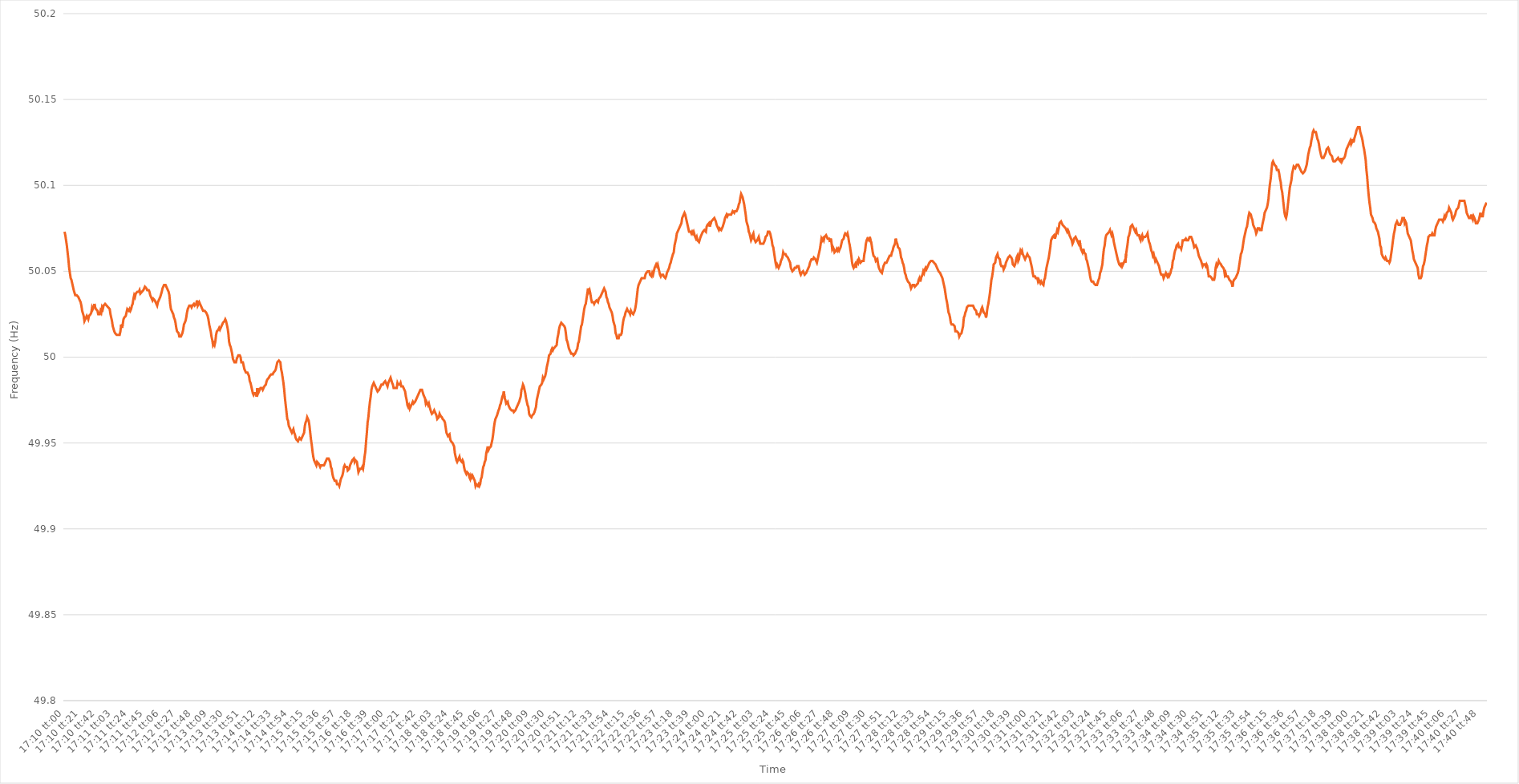
| Category | Series 0 |
|---|---|
| 0.7152777777777778 | 50.073 |
| 0.7152893518518518 | 50.071 |
| 0.7153009259259259 | 50.068 |
| 0.7153125 | 50.065 |
| 0.7153240740740742 | 50.061 |
| 0.7153356481481481 | 50.057 |
| 0.7153472222222222 | 50.052 |
| 0.7153587962962963 | 50.049 |
| 0.7153703703703704 | 50.046 |
| 0.7153819444444444 | 50.045 |
| 0.7153935185185185 | 50.043 |
| 0.7154050925925927 | 50.041 |
| 0.7154166666666667 | 50.039 |
| 0.7154282407407407 | 50.039 |
| 0.7154398148148148 | 50.036 |
| 0.7154513888888889 | 50.036 |
| 0.7154629629629629 | 50.036 |
| 0.715474537037037 | 50.036 |
| 0.7154861111111112 | 50.035 |
| 0.7154976851851852 | 50.034 |
| 0.7155092592592592 | 50.033 |
| 0.7155208333333333 | 50.032 |
| 0.7155324074074074 | 50.03 |
| 0.7155439814814816 | 50.027 |
| 0.7155555555555555 | 50.027 |
| 0.7155671296296297 | 50.024 |
| 0.7155787037037037 | 50.021 |
| 0.7155902777777778 | 50.022 |
| 0.7156018518518518 | 50.022 |
| 0.7156134259259259 | 50.024 |
| 0.7156250000000001 | 50.023 |
| 0.7156365740740741 | 50.022 |
| 0.7156481481481481 | 50.024 |
| 0.7156597222222222 | 50.024 |
| 0.7156712962962963 | 50.025 |
| 0.7156828703703703 | 50.026 |
| 0.7156944444444444 | 50.029 |
| 0.7157060185185186 | 50.028 |
| 0.7157175925925926 | 50.029 |
| 0.7157291666666666 | 50.031 |
| 0.7157407407407407 | 50.029 |
| 0.7157523148148148 | 50.028 |
| 0.715763888888889 | 50.028 |
| 0.7157754629629629 | 50.027 |
| 0.715787037037037 | 50.025 |
| 0.7157986111111111 | 50.025 |
| 0.7158101851851852 | 50.025 |
| 0.7158217592592592 | 50.027 |
| 0.7158333333333333 | 50.026 |
| 0.7158449074074075 | 50.029 |
| 0.7158564814814815 | 50.028 |
| 0.7158680555555555 | 50.03 |
| 0.7158796296296296 | 50.03 |
| 0.7158912037037037 | 50.031 |
| 0.7159027777777779 | 50.031 |
| 0.7159143518518518 | 50.03 |
| 0.715925925925926 | 50.03 |
| 0.7159375 | 50.029 |
| 0.715949074074074 | 50.029 |
| 0.7159606481481481 | 50.028 |
| 0.7159722222222222 | 50.025 |
| 0.7159837962962964 | 50.023 |
| 0.7159953703703703 | 50.021 |
| 0.7160069444444445 | 50.018 |
| 0.7160185185185185 | 50.018 |
| 0.7160300925925926 | 50.015 |
| 0.7160416666666666 | 50.014 |
| 0.7160532407407407 | 50.014 |
| 0.7160648148148149 | 50.013 |
| 0.7160763888888889 | 50.013 |
| 0.716087962962963 | 50.013 |
| 0.716099537037037 | 50.013 |
| 0.7161111111111111 | 50.013 |
| 0.7161226851851853 | 50.015 |
| 0.7161342592592592 | 50.019 |
| 0.7161458333333334 | 50.017 |
| 0.7161574074074074 | 50.019 |
| 0.7161689814814814 | 50.022 |
| 0.7161805555555555 | 50.023 |
| 0.7161921296296296 | 50.023 |
| 0.7162037037037038 | 50.024 |
| 0.7162152777777777 | 50.026 |
| 0.7162268518518519 | 50.028 |
| 0.7162384259259259 | 50.028 |
| 0.71625 | 50.027 |
| 0.716261574074074 | 50.028 |
| 0.7162731481481481 | 50.027 |
| 0.7162847222222223 | 50.028 |
| 0.7162962962962963 | 50.03 |
| 0.7163078703703704 | 50.031 |
| 0.7163194444444444 | 50.034 |
| 0.7163310185185185 | 50.036 |
| 0.7163425925925927 | 50.035 |
| 0.7163541666666666 | 50.037 |
| 0.7163657407407408 | 50.037 |
| 0.7163773148148148 | 50.038 |
| 0.7163888888888889 | 50.038 |
| 0.7164004629629629 | 50.038 |
| 0.716412037037037 | 50.039 |
| 0.7164236111111112 | 50.037 |
| 0.7164351851851851 | 50.037 |
| 0.7164467592592593 | 50.038 |
| 0.7164583333333333 | 50.038 |
| 0.7164699074074075 | 50.039 |
| 0.7164814814814814 | 50.039 |
| 0.7164930555555555 | 50.041 |
| 0.7165046296296297 | 50.041 |
| 0.7165162037037037 | 50.04 |
| 0.7165277777777778 | 50.039 |
| 0.7165393518518518 | 50.039 |
| 0.716550925925926 | 50.039 |
| 0.7165625000000001 | 50.038 |
| 0.716574074074074 | 50.036 |
| 0.7165856481481482 | 50.036 |
| 0.7165972222222222 | 50.034 |
| 0.7166087962962964 | 50.033 |
| 0.7166203703703703 | 50.034 |
| 0.7166319444444444 | 50.034 |
| 0.7166435185185186 | 50.033 |
| 0.7166550925925925 | 50.032 |
| 0.7166666666666667 | 50.031 |
| 0.7166782407407407 | 50.03 |
| 0.7166898148148149 | 50.032 |
| 0.7167013888888888 | 50.033 |
| 0.7167129629629629 | 50.033 |
| 0.7167245370370371 | 50.035 |
| 0.7167361111111111 | 50.035 |
| 0.7167476851851852 | 50.038 |
| 0.7167592592592592 | 50.04 |
| 0.7167708333333334 | 50.041 |
| 0.7167824074074075 | 50.042 |
| 0.7167939814814814 | 50.042 |
| 0.7168055555555556 | 50.042 |
| 0.7168171296296296 | 50.041 |
| 0.7168287037037038 | 50.04 |
| 0.7168402777777777 | 50.04 |
| 0.7168518518518519 | 50.038 |
| 0.716863425925926 | 50.036 |
| 0.7168749999999999 | 50.031 |
| 0.7168865740740741 | 50.028 |
| 0.7168981481481481 | 50.027 |
| 0.7169097222222223 | 50.027 |
| 0.7169212962962962 | 50.025 |
| 0.7169328703703703 | 50.023 |
| 0.7169444444444445 | 50.022 |
| 0.7169560185185185 | 50.02 |
| 0.7169675925925926 | 50.017 |
| 0.7169791666666666 | 50.015 |
| 0.7169907407407408 | 50.015 |
| 0.7170023148148149 | 50.014 |
| 0.7170138888888888 | 50.012 |
| 0.717025462962963 | 50.012 |
| 0.717037037037037 | 50.012 |
| 0.7170486111111112 | 50.012 |
| 0.7170601851851851 | 50.014 |
| 0.7170717592592593 | 50.016 |
| 0.7170833333333334 | 50.019 |
| 0.7170949074074073 | 50.02 |
| 0.7171064814814815 | 50.021 |
| 0.7171180555555555 | 50.023 |
| 0.7171296296296297 | 50.026 |
| 0.7171412037037036 | 50.028 |
| 0.7171527777777778 | 50.028 |
| 0.7171643518518519 | 50.03 |
| 0.7171759259259259 | 50.03 |
| 0.7171875 | 50.03 |
| 0.717199074074074 | 50.029 |
| 0.7172106481481482 | 50.03 |
| 0.7172222222222223 | 50.03 |
| 0.7172337962962962 | 50.031 |
| 0.7172453703703704 | 50.03 |
| 0.7172569444444444 | 50.03 |
| 0.7172685185185186 | 50.031 |
| 0.7172800925925925 | 50.033 |
| 0.7172916666666667 | 50.03 |
| 0.7173032407407408 | 50.031 |
| 0.7173148148148148 | 50.032 |
| 0.7173263888888889 | 50.031 |
| 0.7173379629629629 | 50.03 |
| 0.7173495370370371 | 50.029 |
| 0.717361111111111 | 50.028 |
| 0.7173726851851852 | 50.027 |
| 0.7173842592592593 | 50.027 |
| 0.7173958333333333 | 50.027 |
| 0.7174074074074074 | 50.027 |
| 0.7174189814814814 | 50.026 |
| 0.7174305555555556 | 50.026 |
| 0.7174421296296297 | 50.024 |
| 0.7174537037037036 | 50.022 |
| 0.7174652777777778 | 50.019 |
| 0.7174768518518518 | 50.017 |
| 0.717488425925926 | 50.015 |
| 0.7174999999999999 | 50.012 |
| 0.7175115740740741 | 50.01 |
| 0.7175231481481482 | 50.007 |
| 0.7175347222222223 | 50.008 |
| 0.7175462962962963 | 50.007 |
| 0.7175578703703703 | 50.009 |
| 0.7175694444444445 | 50.013 |
| 0.7175810185185184 | 50.015 |
| 0.7175925925925926 | 50.015 |
| 0.7176041666666667 | 50.016 |
| 0.7176157407407407 | 50.017 |
| 0.7176273148148148 | 50.016 |
| 0.7176388888888888 | 50.017 |
| 0.717650462962963 | 50.018 |
| 0.7176620370370371 | 50.018 |
| 0.717673611111111 | 50.02 |
| 0.7176851851851852 | 50.02 |
| 0.7176967592592592 | 50.021 |
| 0.7177083333333334 | 50.022 |
| 0.7177199074074073 | 50.021 |
| 0.7177314814814815 | 50.019 |
| 0.7177430555555556 | 50.017 |
| 0.7177546296296297 | 50.014 |
| 0.7177662037037037 | 50.009 |
| 0.7177777777777777 | 50.007 |
| 0.7177893518518519 | 50.006 |
| 0.717800925925926 | 50.004 |
| 0.7178125 | 50.002 |
| 0.7178240740740741 | 49.999 |
| 0.7178356481481482 | 49.998 |
| 0.7178472222222222 | 49.997 |
| 0.7178587962962962 | 49.997 |
| 0.7178703703703704 | 49.997 |
| 0.7178819444444445 | 49.999 |
| 0.7178935185185185 | 50 |
| 0.7179050925925926 | 50.001 |
| 0.7179166666666666 | 50.001 |
| 0.7179282407407408 | 50.001 |
| 0.7179398148148147 | 50 |
| 0.7179513888888889 | 49.997 |
| 0.717962962962963 | 49.997 |
| 0.7179745370370371 | 49.997 |
| 0.7179861111111111 | 49.995 |
| 0.7179976851851851 | 49.993 |
| 0.7180092592592593 | 49.992 |
| 0.7180208333333334 | 49.991 |
| 0.7180324074074074 | 49.991 |
| 0.7180439814814815 | 49.991 |
| 0.7180555555555556 | 49.99 |
| 0.7180671296296296 | 49.989 |
| 0.7180787037037036 | 49.986 |
| 0.7180902777777778 | 49.985 |
| 0.7181018518518519 | 49.983 |
| 0.7181134259259259 | 49.981 |
| 0.718125 | 49.979 |
| 0.718136574074074 | 49.978 |
| 0.7181481481481482 | 49.979 |
| 0.7181597222222221 | 49.979 |
| 0.7181712962962963 | 49.979 |
| 0.7181828703703704 | 49.977 |
| 0.7181944444444445 | 49.982 |
| 0.7182060185185185 | 49.979 |
| 0.7182175925925925 | 49.979 |
| 0.7182291666666667 | 49.981 |
| 0.7182407407407408 | 49.982 |
| 0.7182523148148148 | 49.982 |
| 0.7182638888888889 | 49.982 |
| 0.718275462962963 | 49.981 |
| 0.718287037037037 | 49.982 |
| 0.718298611111111 | 49.983 |
| 0.7183101851851852 | 49.983 |
| 0.7183217592592593 | 49.984 |
| 0.7183333333333333 | 49.986 |
| 0.7183449074074074 | 49.987 |
| 0.7183564814814815 | 49.987 |
| 0.7183680555555556 | 49.988 |
| 0.7183796296296295 | 49.989 |
| 0.7183912037037037 | 49.989 |
| 0.7184027777777778 | 49.99 |
| 0.7184143518518519 | 49.99 |
| 0.7184259259259259 | 49.99 |
| 0.7184375 | 49.991 |
| 0.7184490740740741 | 49.991 |
| 0.7184606481481483 | 49.992 |
| 0.7184722222222222 | 49.993 |
| 0.7184837962962963 | 49.995 |
| 0.7184953703703704 | 49.997 |
| 0.7185069444444445 | 49.997 |
| 0.7185185185185184 | 49.998 |
| 0.7185300925925926 | 49.998 |
| 0.7185416666666667 | 49.997 |
| 0.7185532407407407 | 49.993 |
| 0.7185648148148148 | 49.991 |
| 0.7185763888888889 | 49.988 |
| 0.718587962962963 | 49.985 |
| 0.7185995370370369 | 49.981 |
| 0.7186111111111111 | 49.976 |
| 0.7186226851851852 | 49.972 |
| 0.7186342592592593 | 49.968 |
| 0.7186458333333333 | 49.964 |
| 0.7186574074074074 | 49.963 |
| 0.7186689814814815 | 49.96 |
| 0.7186805555555557 | 49.959 |
| 0.7186921296296296 | 49.958 |
| 0.7187037037037037 | 49.958 |
| 0.7187152777777778 | 49.956 |
| 0.7187268518518519 | 49.956 |
| 0.7187384259259259 | 49.958 |
| 0.71875 | 49.956 |
| 0.7187615740740741 | 49.955 |
| 0.7187731481481481 | 49.953 |
| 0.7187847222222222 | 49.952 |
| 0.7187962962962963 | 49.952 |
| 0.7188078703703704 | 49.951 |
| 0.7188194444444443 | 49.952 |
| 0.7188310185185185 | 49.953 |
| 0.7188425925925926 | 49.953 |
| 0.7188541666666667 | 49.952 |
| 0.7188657407407407 | 49.953 |
| 0.7188773148148148 | 49.954 |
| 0.7188888888888889 | 49.955 |
| 0.7189004629629631 | 49.956 |
| 0.718912037037037 | 49.96 |
| 0.7189236111111111 | 49.962 |
| 0.7189351851851852 | 49.963 |
| 0.7189467592592593 | 49.965 |
| 0.7189583333333333 | 49.965 |
| 0.7189699074074074 | 49.963 |
| 0.7189814814814816 | 49.96 |
| 0.7189930555555555 | 49.956 |
| 0.7190046296296296 | 49.952 |
| 0.7190162037037037 | 49.949 |
| 0.7190277777777778 | 49.945 |
| 0.7190393518518517 | 49.942 |
| 0.7190509259259259 | 49.94 |
| 0.7190625 | 49.939 |
| 0.7190740740740741 | 49.938 |
| 0.7190856481481481 | 49.937 |
| 0.7190972222222222 | 49.939 |
| 0.7191087962962963 | 49.939 |
| 0.7191203703703705 | 49.938 |
| 0.7191319444444444 | 49.937 |
| 0.7191435185185185 | 49.936 |
| 0.7191550925925926 | 49.937 |
| 0.7191666666666667 | 49.937 |
| 0.7191782407407407 | 49.937 |
| 0.7191898148148148 | 49.937 |
| 0.719201388888889 | 49.937 |
| 0.719212962962963 | 49.937 |
| 0.719224537037037 | 49.939 |
| 0.7192361111111111 | 49.94 |
| 0.7192476851851852 | 49.941 |
| 0.7192592592592592 | 49.941 |
| 0.7192708333333333 | 49.941 |
| 0.7192824074074075 | 49.94 |
| 0.7192939814814815 | 49.939 |
| 0.7193055555555555 | 49.936 |
| 0.7193171296296296 | 49.935 |
| 0.7193287037037037 | 49.932 |
| 0.7193402777777779 | 49.93 |
| 0.7193518518518518 | 49.929 |
| 0.719363425925926 | 49.928 |
| 0.719375 | 49.928 |
| 0.7193865740740741 | 49.928 |
| 0.7193981481481481 | 49.926 |
| 0.7194097222222222 | 49.926 |
| 0.7194212962962964 | 49.926 |
| 0.7194328703703704 | 49.925 |
| 0.7194444444444444 | 49.927 |
| 0.7194560185185185 | 49.929 |
| 0.7194675925925926 | 49.93 |
| 0.7194791666666666 | 49.931 |
| 0.7194907407407407 | 49.933 |
| 0.7195023148148149 | 49.936 |
| 0.7195138888888889 | 49.937 |
| 0.7195254629629629 | 49.936 |
| 0.719537037037037 | 49.936 |
| 0.7195486111111111 | 49.936 |
| 0.7195601851851853 | 49.934 |
| 0.7195717592592592 | 49.934 |
| 0.7195833333333334 | 49.935 |
| 0.7195949074074074 | 49.937 |
| 0.7196064814814815 | 49.937 |
| 0.7196180555555555 | 49.939 |
| 0.7196296296296296 | 49.94 |
| 0.7196412037037038 | 49.94 |
| 0.7196527777777778 | 49.941 |
| 0.7196643518518518 | 49.939 |
| 0.7196759259259259 | 49.94 |
| 0.7196875 | 49.94 |
| 0.719699074074074 | 49.939 |
| 0.7197106481481481 | 49.936 |
| 0.7197222222222223 | 49.933 |
| 0.7197337962962963 | 49.934 |
| 0.7197453703703703 | 49.935 |
| 0.7197569444444444 | 49.935 |
| 0.7197685185185185 | 49.935 |
| 0.7197800925925927 | 49.936 |
| 0.7197916666666666 | 49.935 |
| 0.7198032407407408 | 49.938 |
| 0.7198148148148148 | 49.942 |
| 0.719826388888889 | 49.945 |
| 0.7198379629629629 | 49.951 |
| 0.719849537037037 | 49.956 |
| 0.7198611111111112 | 49.962 |
| 0.7198726851851852 | 49.965 |
| 0.7198842592592593 | 49.97 |
| 0.7198958333333333 | 49.974 |
| 0.7199074074074074 | 49.977 |
| 0.7199189814814816 | 49.981 |
| 0.7199305555555555 | 49.983 |
| 0.7199421296296297 | 49.984 |
| 0.7199537037037037 | 49.985 |
| 0.7199652777777777 | 49.985 |
| 0.7199768518518518 | 49.983 |
| 0.7199884259259259 | 49.982 |
| 0.7200000000000001 | 49.981 |
| 0.720011574074074 | 49.98 |
| 0.7200231481481482 | 49.98 |
| 0.7200347222222222 | 49.981 |
| 0.7200462962962964 | 49.982 |
| 0.7200578703703703 | 49.983 |
| 0.7200694444444444 | 49.984 |
| 0.7200810185185186 | 49.984 |
| 0.7200925925925926 | 49.984 |
| 0.7201041666666667 | 49.985 |
| 0.7201157407407407 | 49.985 |
| 0.7201273148148148 | 49.986 |
| 0.720138888888889 | 49.986 |
| 0.7201504629629629 | 49.984 |
| 0.7201620370370371 | 49.983 |
| 0.7201736111111111 | 49.985 |
| 0.7201851851851852 | 49.986 |
| 0.7201967592592592 | 49.987 |
| 0.7202083333333333 | 49.988 |
| 0.7202199074074075 | 49.988 |
| 0.7202314814814814 | 49.985 |
| 0.7202430555555556 | 49.984 |
| 0.7202546296296296 | 49.982 |
| 0.7202662037037038 | 49.982 |
| 0.7202777777777777 | 49.982 |
| 0.7202893518518518 | 49.982 |
| 0.720300925925926 | 49.982 |
| 0.7203125 | 49.985 |
| 0.7203240740740741 | 49.984 |
| 0.7203356481481481 | 49.984 |
| 0.7203472222222222 | 49.984 |
| 0.7203587962962964 | 49.985 |
| 0.7203703703703703 | 49.983 |
| 0.7203819444444445 | 49.983 |
| 0.7203935185185185 | 49.983 |
| 0.7204050925925927 | 49.982 |
| 0.7204166666666666 | 49.981 |
| 0.7204282407407407 | 49.98 |
| 0.7204398148148149 | 49.977 |
| 0.7204513888888888 | 49.975 |
| 0.720462962962963 | 49.972 |
| 0.720474537037037 | 49.971 |
| 0.7204861111111112 | 49.972 |
| 0.7204976851851851 | 49.97 |
| 0.7205092592592592 | 49.971 |
| 0.7205208333333334 | 49.972 |
| 0.7205324074074074 | 49.973 |
| 0.7205439814814815 | 49.974 |
| 0.7205555555555555 | 49.973 |
| 0.7205671296296297 | 49.973 |
| 0.7205787037037038 | 49.974 |
| 0.7205902777777777 | 49.975 |
| 0.7206018518518519 | 49.976 |
| 0.7206134259259259 | 49.977 |
| 0.7206250000000001 | 49.978 |
| 0.720636574074074 | 49.979 |
| 0.7206481481481481 | 49.979 |
| 0.7206597222222223 | 49.981 |
| 0.7206712962962962 | 49.981 |
| 0.7206828703703704 | 49.981 |
| 0.7206944444444444 | 49.981 |
| 0.7207060185185186 | 49.978 |
| 0.7207175925925925 | 49.977 |
| 0.7207291666666666 | 49.976 |
| 0.7207407407407408 | 49.973 |
| 0.7207523148148148 | 49.974 |
| 0.7207638888888889 | 49.973 |
| 0.7207754629629629 | 49.972 |
| 0.7207870370370371 | 49.973 |
| 0.7207986111111112 | 49.971 |
| 0.7208101851851851 | 49.971 |
| 0.7208217592592593 | 49.968 |
| 0.7208333333333333 | 49.967 |
| 0.7208449074074075 | 49.967 |
| 0.7208564814814814 | 49.968 |
| 0.7208680555555556 | 49.969 |
| 0.7208796296296297 | 49.968 |
| 0.7208912037037036 | 49.967 |
| 0.7209027777777778 | 49.966 |
| 0.7209143518518518 | 49.964 |
| 0.720925925925926 | 49.964 |
| 0.7209374999999999 | 49.965 |
| 0.720949074074074 | 49.967 |
| 0.7209606481481482 | 49.966 |
| 0.7209722222222222 | 49.966 |
| 0.7209837962962963 | 49.965 |
| 0.7209953703703703 | 49.964 |
| 0.7210069444444445 | 49.964 |
| 0.7210185185185186 | 49.963 |
| 0.7210300925925925 | 49.962 |
| 0.7210416666666667 | 49.959 |
| 0.7210532407407407 | 49.956 |
| 0.7210648148148149 | 49.956 |
| 0.7210763888888888 | 49.954 |
| 0.721087962962963 | 49.954 |
| 0.7210995370370371 | 49.955 |
| 0.721111111111111 | 49.952 |
| 0.7211226851851852 | 49.951 |
| 0.7211342592592592 | 49.951 |
| 0.7211458333333334 | 49.95 |
| 0.7211574074074073 | 49.95 |
| 0.7211689814814815 | 49.948 |
| 0.7211805555555556 | 49.944 |
| 0.7211921296296296 | 49.942 |
| 0.7212037037037037 | 49.94 |
| 0.7212152777777777 | 49.939 |
| 0.7212268518518519 | 49.94 |
| 0.721238425925926 | 49.94 |
| 0.72125 | 49.942 |
| 0.7212615740740741 | 49.94 |
| 0.7212731481481481 | 49.94 |
| 0.7212847222222223 | 49.939 |
| 0.7212962962962962 | 49.94 |
| 0.7213078703703704 | 49.939 |
| 0.7213194444444445 | 49.936 |
| 0.7213310185185186 | 49.934 |
| 0.7213425925925926 | 49.934 |
| 0.7213541666666666 | 49.932 |
| 0.7213657407407408 | 49.933 |
| 0.7213773148148147 | 49.933 |
| 0.7213888888888889 | 49.932 |
| 0.721400462962963 | 49.93 |
| 0.721412037037037 | 49.929 |
| 0.7214236111111111 | 49.931 |
| 0.7214351851851851 | 49.93 |
| 0.7214467592592593 | 49.931 |
| 0.7214583333333334 | 49.93 |
| 0.7214699074074074 | 49.929 |
| 0.7214814814814815 | 49.928 |
| 0.7214930555555555 | 49.925 |
| 0.7215046296296297 | 49.926 |
| 0.7215162037037036 | 49.926 |
| 0.7215277777777778 | 49.925 |
| 0.7215393518518519 | 49.926 |
| 0.721550925925926 | 49.925 |
| 0.7215625 | 49.926 |
| 0.721574074074074 | 49.929 |
| 0.7215856481481482 | 49.93 |
| 0.7215972222222223 | 49.933 |
| 0.7216087962962963 | 49.936 |
| 0.7216203703703704 | 49.937 |
| 0.7216319444444445 | 49.939 |
| 0.7216435185185185 | 49.94 |
| 0.7216550925925925 | 49.944 |
| 0.7216666666666667 | 49.946 |
| 0.7216782407407408 | 49.948 |
| 0.7216898148148148 | 49.946 |
| 0.7217013888888889 | 49.947 |
| 0.721712962962963 | 49.947 |
| 0.7217245370370371 | 49.948 |
| 0.721736111111111 | 49.95 |
| 0.7217476851851852 | 49.952 |
| 0.7217592592592593 | 49.955 |
| 0.7217708333333334 | 49.959 |
| 0.7217824074074074 | 49.962 |
| 0.7217939814814814 | 49.964 |
| 0.7218055555555556 | 49.965 |
| 0.7218171296296297 | 49.966 |
| 0.7218287037037037 | 49.966 |
| 0.7218402777777778 | 49.969 |
| 0.7218518518518519 | 49.97 |
| 0.7218634259259259 | 49.972 |
| 0.7218749999999999 | 49.973 |
| 0.7218865740740741 | 49.975 |
| 0.7218981481481482 | 49.977 |
| 0.7219097222222222 | 49.978 |
| 0.7219212962962963 | 49.98 |
| 0.7219328703703703 | 49.976 |
| 0.7219444444444445 | 49.975 |
| 0.7219560185185184 | 49.973 |
| 0.7219675925925926 | 49.973 |
| 0.7219791666666667 | 49.974 |
| 0.7219907407407408 | 49.972 |
| 0.7220023148148148 | 49.971 |
| 0.7220138888888888 | 49.97 |
| 0.722025462962963 | 49.97 |
| 0.7220370370370371 | 49.969 |
| 0.7220486111111111 | 49.969 |
| 0.7220601851851852 | 49.969 |
| 0.7220717592592593 | 49.968 |
| 0.7220833333333333 | 49.968 |
| 0.7220949074074073 | 49.969 |
| 0.7221064814814815 | 49.97 |
| 0.7221180555555556 | 49.971 |
| 0.7221296296296296 | 49.972 |
| 0.7221412037037037 | 49.973 |
| 0.7221527777777778 | 49.974 |
| 0.7221643518518519 | 49.974 |
| 0.7221759259259258 | 49.977 |
| 0.7221875 | 49.981 |
| 0.7221990740740741 | 49.982 |
| 0.7222106481481482 | 49.984 |
| 0.7222222222222222 | 49.983 |
| 0.7222337962962962 | 49.981 |
| 0.7222453703703704 | 49.979 |
| 0.7222569444444445 | 49.976 |
| 0.7222685185185185 | 49.974 |
| 0.7222800925925926 | 49.972 |
| 0.7222916666666667 | 49.971 |
| 0.7223032407407407 | 49.967 |
| 0.7223148148148147 | 49.966 |
| 0.7223263888888889 | 49.966 |
| 0.722337962962963 | 49.965 |
| 0.722349537037037 | 49.966 |
| 0.7223611111111111 | 49.966 |
| 0.7223726851851852 | 49.967 |
| 0.7223842592592593 | 49.968 |
| 0.7223958333333332 | 49.968 |
| 0.7224074074074074 | 49.971 |
| 0.7224189814814815 | 49.975 |
| 0.7224305555555556 | 49.977 |
| 0.7224421296296296 | 49.979 |
| 0.7224537037037037 | 49.981 |
| 0.7224652777777778 | 49.983 |
| 0.722476851851852 | 49.983 |
| 0.7224884259259259 | 49.984 |
| 0.7225 | 49.985 |
| 0.7225115740740741 | 49.988 |
| 0.7225231481481482 | 49.987 |
| 0.7225347222222221 | 49.988 |
| 0.7225462962962963 | 49.989 |
| 0.7225578703703704 | 49.991 |
| 0.7225694444444444 | 49.994 |
| 0.7225810185185185 | 49.996 |
| 0.7225925925925926 | 49.998 |
| 0.7226041666666667 | 50.001 |
| 0.7226157407407406 | 50.001 |
| 0.7226273148148148 | 50.002 |
| 0.7226388888888889 | 50.004 |
| 0.722650462962963 | 50.005 |
| 0.722662037037037 | 50.004 |
| 0.7226736111111111 | 50.005 |
| 0.7226851851851852 | 50.005 |
| 0.7226967592592594 | 50.006 |
| 0.7227083333333333 | 50.006 |
| 0.7227199074074074 | 50.007 |
| 0.7227314814814815 | 50.011 |
| 0.7227430555555556 | 50.013 |
| 0.7227546296296296 | 50.016 |
| 0.7227662037037037 | 50.018 |
| 0.7227777777777779 | 50.019 |
| 0.7227893518518518 | 50.02 |
| 0.7228009259259259 | 50.02 |
| 0.7228125 | 50.019 |
| 0.7228240740740741 | 50.019 |
| 0.722835648148148 | 50.018 |
| 0.7228472222222222 | 50.017 |
| 0.7228587962962963 | 50.014 |
| 0.7228703703703704 | 50.01 |
| 0.7228819444444444 | 50.009 |
| 0.7228935185185185 | 50.007 |
| 0.7229050925925926 | 50.005 |
| 0.7229166666666668 | 50.004 |
| 0.7229282407407407 | 50.003 |
| 0.7229398148148148 | 50.002 |
| 0.7229513888888889 | 50.002 |
| 0.722962962962963 | 50.002 |
| 0.722974537037037 | 50.001 |
| 0.7229861111111111 | 50.001 |
| 0.7229976851851853 | 50.002 |
| 0.7230092592592593 | 50.003 |
| 0.7230208333333333 | 50.004 |
| 0.7230324074074074 | 50.005 |
| 0.7230439814814815 | 50.008 |
| 0.7230555555555555 | 50.009 |
| 0.7230671296296296 | 50.012 |
| 0.7230787037037038 | 50.015 |
| 0.7230902777777778 | 50.018 |
| 0.7231018518518518 | 50.019 |
| 0.7231134259259259 | 50.022 |
| 0.723125 | 50.025 |
| 0.7231365740740742 | 50.028 |
| 0.7231481481481481 | 50.03 |
| 0.7231597222222222 | 50.031 |
| 0.7231712962962963 | 50.034 |
| 0.7231828703703704 | 50.037 |
| 0.7231944444444444 | 50.04 |
| 0.7232060185185185 | 50.038 |
| 0.7232175925925927 | 50.039 |
| 0.7232291666666667 | 50.037 |
| 0.7232407407407407 | 50.034 |
| 0.7232523148148148 | 50.032 |
| 0.7232638888888889 | 50.032 |
| 0.7232754629629629 | 50.032 |
| 0.723287037037037 | 50.031 |
| 0.7232986111111112 | 50.032 |
| 0.7233101851851852 | 50.032 |
| 0.7233217592592592 | 50.033 |
| 0.7233333333333333 | 50.033 |
| 0.7233449074074074 | 50.032 |
| 0.7233564814814816 | 50.034 |
| 0.7233680555555555 | 50.034 |
| 0.7233796296296297 | 50.035 |
| 0.7233912037037037 | 50.035 |
| 0.7234027777777778 | 50.037 |
| 0.7234143518518518 | 50.037 |
| 0.7234259259259259 | 50.039 |
| 0.7234375000000001 | 50.04 |
| 0.7234490740740741 | 50.039 |
| 0.7234606481481481 | 50.038 |
| 0.7234722222222222 | 50.035 |
| 0.7234837962962963 | 50.034 |
| 0.7234953703703703 | 50.032 |
| 0.7235069444444444 | 50.031 |
| 0.7235185185185186 | 50.029 |
| 0.7235300925925926 | 50.028 |
| 0.7235416666666666 | 50.027 |
| 0.7235532407407407 | 50.026 |
| 0.7235648148148148 | 50.024 |
| 0.723576388888889 | 50.021 |
| 0.7235879629629629 | 50.021 |
| 0.723599537037037 | 50.018 |
| 0.7236111111111111 | 50.014 |
| 0.7236226851851852 | 50.013 |
| 0.7236342592592592 | 50.011 |
| 0.7236458333333333 | 50.011 |
| 0.7236574074074075 | 50.011 |
| 0.7236689814814815 | 50.013 |
| 0.7236805555555555 | 50.013 |
| 0.7236921296296296 | 50.013 |
| 0.7237037037037037 | 50.014 |
| 0.7237152777777777 | 50.018 |
| 0.7237268518518518 | 50.021 |
| 0.723738425925926 | 50.023 |
| 0.72375 | 50.024 |
| 0.723761574074074 | 50.026 |
| 0.7237731481481481 | 50.026 |
| 0.7237847222222222 | 50.028 |
| 0.7237962962962964 | 50.027 |
| 0.7238078703703703 | 50.027 |
| 0.7238194444444445 | 50.026 |
| 0.7238310185185185 | 50.025 |
| 0.7238425925925926 | 50.027 |
| 0.7238541666666666 | 50.026 |
| 0.7238657407407407 | 50.026 |
| 0.7238773148148149 | 50.025 |
| 0.7238888888888889 | 50.025 |
| 0.723900462962963 | 50.027 |
| 0.723912037037037 | 50.029 |
| 0.7239236111111111 | 50.032 |
| 0.7239351851851853 | 50.036 |
| 0.7239467592592592 | 50.04 |
| 0.7239583333333334 | 50.042 |
| 0.7239699074074074 | 50.043 |
| 0.7239814814814814 | 50.044 |
| 0.7239930555555555 | 50.045 |
| 0.7240046296296296 | 50.046 |
| 0.7240162037037038 | 50.046 |
| 0.7240277777777777 | 50.046 |
| 0.7240393518518519 | 50.046 |
| 0.7240509259259259 | 50.046 |
| 0.7240625 | 50.048 |
| 0.724074074074074 | 50.049 |
| 0.7240856481481481 | 50.049 |
| 0.7240972222222223 | 50.05 |
| 0.7241087962962963 | 50.05 |
| 0.7241203703703704 | 50.05 |
| 0.7241319444444444 | 50.048 |
| 0.7241435185185185 | 50.048 |
| 0.7241550925925927 | 50.047 |
| 0.7241666666666666 | 50.049 |
| 0.7241782407407408 | 50.048 |
| 0.7241898148148148 | 50.05 |
| 0.724201388888889 | 50.052 |
| 0.7242129629629629 | 50.053 |
| 0.724224537037037 | 50.054 |
| 0.7242361111111112 | 50.053 |
| 0.7242476851851851 | 50.054 |
| 0.7242592592592593 | 50.052 |
| 0.7242708333333333 | 50.05 |
| 0.7242824074074075 | 50.048 |
| 0.7242939814814814 | 50.047 |
| 0.7243055555555555 | 50.048 |
| 0.7243171296296297 | 50.048 |
| 0.7243287037037037 | 50.048 |
| 0.7243402777777778 | 50.047 |
| 0.7243518518518518 | 50.047 |
| 0.724363425925926 | 50.046 |
| 0.7243750000000001 | 50.047 |
| 0.724386574074074 | 50.049 |
| 0.7243981481481482 | 50.049 |
| 0.7244097222222222 | 50.051 |
| 0.7244212962962964 | 50.052 |
| 0.7244328703703703 | 50.054 |
| 0.7244444444444444 | 50.055 |
| 0.7244560185185186 | 50.057 |
| 0.7244675925925925 | 50.057 |
| 0.7244791666666667 | 50.06 |
| 0.7244907407407407 | 50.061 |
| 0.7245023148148149 | 50.065 |
| 0.7245138888888888 | 50.067 |
| 0.7245254629629629 | 50.069 |
| 0.7245370370370371 | 50.072 |
| 0.7245486111111111 | 50.073 |
| 0.7245601851851852 | 50.074 |
| 0.7245717592592592 | 50.075 |
| 0.7245833333333334 | 50.075 |
| 0.7245949074074075 | 50.077 |
| 0.7246064814814814 | 50.078 |
| 0.7246180555555556 | 50.081 |
| 0.7246296296296296 | 50.081 |
| 0.7246412037037038 | 50.083 |
| 0.7246527777777777 | 50.084 |
| 0.7246643518518519 | 50.083 |
| 0.724675925925926 | 50.081 |
| 0.7246874999999999 | 50.079 |
| 0.7246990740740741 | 50.077 |
| 0.7247106481481481 | 50.075 |
| 0.7247222222222223 | 50.073 |
| 0.7247337962962962 | 50.073 |
| 0.7247453703703703 | 50.073 |
| 0.7247569444444445 | 50.072 |
| 0.7247685185185185 | 50.073 |
| 0.7247800925925926 | 50.072 |
| 0.7247916666666666 | 50.073 |
| 0.7248032407407408 | 50.073 |
| 0.7248148148148149 | 50.07 |
| 0.7248263888888888 | 50.069 |
| 0.724837962962963 | 50.07 |
| 0.724849537037037 | 50.068 |
| 0.7248611111111112 | 50.068 |
| 0.7248726851851851 | 50.067 |
| 0.7248842592592593 | 50.067 |
| 0.7248958333333334 | 50.07 |
| 0.7249074074074073 | 50.071 |
| 0.7249189814814815 | 50.072 |
| 0.7249305555555555 | 50.073 |
| 0.7249421296296297 | 50.073 |
| 0.7249537037037036 | 50.074 |
| 0.7249652777777778 | 50.074 |
| 0.7249768518518519 | 50.073 |
| 0.7249884259259259 | 50.076 |
| 0.725 | 50.077 |
| 0.725011574074074 | 50.077 |
| 0.7250231481481482 | 50.078 |
| 0.7250347222222223 | 50.076 |
| 0.7250462962962962 | 50.076 |
| 0.7250578703703704 | 50.079 |
| 0.7250694444444444 | 50.079 |
| 0.7250810185185186 | 50.08 |
| 0.7250925925925925 | 50.08 |
| 0.7251041666666667 | 50.081 |
| 0.7251157407407408 | 50.081 |
| 0.7251273148148148 | 50.079 |
| 0.7251388888888889 | 50.077 |
| 0.7251504629629629 | 50.076 |
| 0.7251620370370371 | 50.075 |
| 0.725173611111111 | 50.074 |
| 0.7251851851851852 | 50.075 |
| 0.7251967592592593 | 50.075 |
| 0.7252083333333333 | 50.074 |
| 0.7252199074074074 | 50.075 |
| 0.7252314814814814 | 50.076 |
| 0.7252430555555556 | 50.076 |
| 0.7252546296296297 | 50.079 |
| 0.7252662037037036 | 50.081 |
| 0.7252777777777778 | 50.082 |
| 0.7252893518518518 | 50.083 |
| 0.725300925925926 | 50.082 |
| 0.7253124999999999 | 50.083 |
| 0.7253240740740741 | 50.083 |
| 0.7253356481481482 | 50.083 |
| 0.7253472222222223 | 50.083 |
| 0.7253587962962963 | 50.083 |
| 0.7253703703703703 | 50.084 |
| 0.7253819444444445 | 50.085 |
| 0.7253935185185184 | 50.085 |
| 0.7254050925925926 | 50.084 |
| 0.7254166666666667 | 50.085 |
| 0.7254282407407407 | 50.085 |
| 0.7254398148148148 | 50.085 |
| 0.7254513888888888 | 50.085 |
| 0.725462962962963 | 50.087 |
| 0.7254745370370371 | 50.089 |
| 0.725486111111111 | 50.09 |
| 0.7254976851851852 | 50.093 |
| 0.7255092592592592 | 50.095 |
| 0.7255208333333334 | 50.095 |
| 0.7255324074074073 | 50.093 |
| 0.7255439814814815 | 50.091 |
| 0.7255555555555556 | 50.089 |
| 0.7255671296296297 | 50.086 |
| 0.7255787037037037 | 50.083 |
| 0.7255902777777777 | 50.079 |
| 0.7256018518518519 | 50.079 |
| 0.725613425925926 | 50.076 |
| 0.725625 | 50.073 |
| 0.7256365740740741 | 50.072 |
| 0.7256481481481482 | 50.07 |
| 0.7256597222222222 | 50.068 |
| 0.7256712962962962 | 50.069 |
| 0.7256828703703704 | 50.071 |
| 0.7256944444444445 | 50.072 |
| 0.7257060185185185 | 50.069 |
| 0.7257175925925926 | 50.069 |
| 0.7257291666666666 | 50.067 |
| 0.7257407407407408 | 50.067 |
| 0.7257523148148147 | 50.068 |
| 0.7257638888888889 | 50.068 |
| 0.725775462962963 | 50.07 |
| 0.7257870370370371 | 50.068 |
| 0.7257986111111111 | 50.066 |
| 0.7258101851851851 | 50.066 |
| 0.7258217592592593 | 50.066 |
| 0.7258333333333334 | 50.066 |
| 0.7258449074074074 | 50.066 |
| 0.7258564814814815 | 50.067 |
| 0.7258680555555556 | 50.068 |
| 0.7258796296296296 | 50.07 |
| 0.7258912037037036 | 50.07 |
| 0.7259027777777778 | 50.071 |
| 0.7259143518518519 | 50.073 |
| 0.7259259259259259 | 50.073 |
| 0.7259375 | 50.073 |
| 0.725949074074074 | 50.072 |
| 0.7259606481481482 | 50.07 |
| 0.7259722222222221 | 50.068 |
| 0.7259837962962963 | 50.065 |
| 0.7259953703703704 | 50.064 |
| 0.7260069444444445 | 50.061 |
| 0.7260185185185185 | 50.058 |
| 0.7260300925925925 | 50.055 |
| 0.7260416666666667 | 50.053 |
| 0.7260532407407408 | 50.054 |
| 0.7260648148148148 | 50.053 |
| 0.7260763888888889 | 50.052 |
| 0.726087962962963 | 50.053 |
| 0.726099537037037 | 50.054 |
| 0.726111111111111 | 50.056 |
| 0.7261226851851852 | 50.057 |
| 0.7261342592592593 | 50.058 |
| 0.7261458333333333 | 50.061 |
| 0.7261574074074074 | 50.06 |
| 0.7261689814814815 | 50.06 |
| 0.7261805555555556 | 50.06 |
| 0.7261921296296295 | 50.059 |
| 0.7262037037037037 | 50.059 |
| 0.7262152777777778 | 50.058 |
| 0.7262268518518519 | 50.057 |
| 0.7262384259259259 | 50.056 |
| 0.72625 | 50.055 |
| 0.7262615740740741 | 50.052 |
| 0.7262731481481483 | 50.051 |
| 0.7262847222222222 | 50.05 |
| 0.7262962962962963 | 50.05 |
| 0.7263078703703704 | 50.051 |
| 0.7263194444444444 | 50.052 |
| 0.7263310185185184 | 50.052 |
| 0.7263425925925926 | 50.052 |
| 0.7263541666666667 | 50.053 |
| 0.7263657407407407 | 50.053 |
| 0.7263773148148148 | 50.053 |
| 0.7263888888888889 | 50.053 |
| 0.726400462962963 | 50.049 |
| 0.7264120370370369 | 50.048 |
| 0.7264236111111111 | 50.049 |
| 0.7264351851851852 | 50.049 |
| 0.7264467592592593 | 50.05 |
| 0.7264583333333333 | 50.049 |
| 0.7264699074074074 | 50.048 |
| 0.7264814814814815 | 50.048 |
| 0.7264930555555557 | 50.049 |
| 0.7265046296296296 | 50.05 |
| 0.7265162037037037 | 50.051 |
| 0.7265277777777778 | 50.052 |
| 0.7265393518518519 | 50.053 |
| 0.7265509259259259 | 50.055 |
| 0.7265625 | 50.055 |
| 0.7265740740740741 | 50.057 |
| 0.7265856481481481 | 50.057 |
| 0.7265972222222222 | 50.057 |
| 0.7266087962962963 | 50.058 |
| 0.7266203703703704 | 50.058 |
| 0.7266319444444443 | 50.057 |
| 0.7266435185185185 | 50.057 |
| 0.7266550925925926 | 50.055 |
| 0.7266666666666667 | 50.057 |
| 0.7266782407407407 | 50.059 |
| 0.7266898148148148 | 50.061 |
| 0.7267013888888889 | 50.063 |
| 0.7267129629629631 | 50.066 |
| 0.726724537037037 | 50.069 |
| 0.7267361111111111 | 50.068 |
| 0.7267476851851852 | 50.069 |
| 0.7267592592592593 | 50.068 |
| 0.7267708333333333 | 50.07 |
| 0.7267824074074074 | 50.07 |
| 0.7267939814814816 | 50.071 |
| 0.7268055555555556 | 50.07 |
| 0.7268171296296296 | 50.069 |
| 0.7268287037037037 | 50.069 |
| 0.7268402777777778 | 50.069 |
| 0.7268518518518517 | 50.067 |
| 0.7268634259259259 | 50.069 |
| 0.726875 | 50.067 |
| 0.7268865740740741 | 50.063 |
| 0.7268981481481481 | 50.064 |
| 0.7269097222222222 | 50.063 |
| 0.7269212962962963 | 50.061 |
| 0.7269328703703705 | 50.061 |
| 0.7269444444444444 | 50.062 |
| 0.7269560185185185 | 50.063 |
| 0.7269675925925926 | 50.062 |
| 0.7269791666666667 | 50.063 |
| 0.7269907407407407 | 50.062 |
| 0.7270023148148148 | 50.063 |
| 0.727013888888889 | 50.064 |
| 0.727025462962963 | 50.066 |
| 0.727037037037037 | 50.068 |
| 0.7270486111111111 | 50.068 |
| 0.7270601851851852 | 50.069 |
| 0.7270717592592592 | 50.071 |
| 0.7270833333333333 | 50.072 |
| 0.7270949074074075 | 50.072 |
| 0.7271064814814815 | 50.071 |
| 0.7271180555555555 | 50.072 |
| 0.7271296296296296 | 50.07 |
| 0.7271412037037037 | 50.067 |
| 0.7271527777777779 | 50.065 |
| 0.7271643518518518 | 50.062 |
| 0.727175925925926 | 50.059 |
| 0.7271875 | 50.055 |
| 0.7271990740740741 | 50.053 |
| 0.7272106481481481 | 50.052 |
| 0.7272222222222222 | 50.052 |
| 0.7272337962962964 | 50.054 |
| 0.7272453703703704 | 50.052 |
| 0.7272569444444444 | 50.055 |
| 0.7272685185185185 | 50.056 |
| 0.7272800925925926 | 50.055 |
| 0.7272916666666666 | 50.057 |
| 0.7273032407407407 | 50.056 |
| 0.7273148148148149 | 50.055 |
| 0.7273263888888889 | 50.055 |
| 0.7273379629629629 | 50.056 |
| 0.727349537037037 | 50.056 |
| 0.7273611111111111 | 50.056 |
| 0.7273726851851853 | 50.06 |
| 0.7273842592592592 | 50.062 |
| 0.7273958333333334 | 50.066 |
| 0.7274074074074074 | 50.068 |
| 0.7274189814814815 | 50.069 |
| 0.7274305555555555 | 50.069 |
| 0.7274421296296296 | 50.068 |
| 0.7274537037037038 | 50.07 |
| 0.7274652777777778 | 50.068 |
| 0.7274768518518518 | 50.067 |
| 0.7274884259259259 | 50.064 |
| 0.7275 | 50.061 |
| 0.727511574074074 | 50.059 |
| 0.7275231481481481 | 50.059 |
| 0.7275347222222223 | 50.058 |
| 0.7275462962962963 | 50.056 |
| 0.7275578703703703 | 50.056 |
| 0.7275694444444444 | 50.057 |
| 0.7275810185185185 | 50.054 |
| 0.7275925925925927 | 50.052 |
| 0.7276041666666666 | 50.051 |
| 0.7276157407407408 | 50.05 |
| 0.7276273148148148 | 50.05 |
| 0.727638888888889 | 50.049 |
| 0.7276504629629629 | 50.051 |
| 0.727662037037037 | 50.053 |
| 0.7276736111111112 | 50.053 |
| 0.7276851851851852 | 50.055 |
| 0.7276967592592593 | 50.055 |
| 0.7277083333333333 | 50.055 |
| 0.7277199074074074 | 50.056 |
| 0.7277314814814816 | 50.057 |
| 0.7277430555555555 | 50.058 |
| 0.7277546296296297 | 50.059 |
| 0.7277662037037037 | 50.059 |
| 0.7277777777777777 | 50.059 |
| 0.7277893518518518 | 50.061 |
| 0.7278009259259259 | 50.062 |
| 0.7278125000000001 | 50.064 |
| 0.727824074074074 | 50.065 |
| 0.7278356481481482 | 50.066 |
| 0.7278472222222222 | 50.069 |
| 0.7278587962962964 | 50.067 |
| 0.7278703703703703 | 50.066 |
| 0.7278819444444444 | 50.064 |
| 0.7278935185185186 | 50.064 |
| 0.7279050925925926 | 50.063 |
| 0.7279166666666667 | 50.061 |
| 0.7279282407407407 | 50.058 |
| 0.7279398148148148 | 50.057 |
| 0.727951388888889 | 50.055 |
| 0.7279629629629629 | 50.054 |
| 0.7279745370370371 | 50.052 |
| 0.7279861111111111 | 50.049 |
| 0.7279976851851852 | 50.048 |
| 0.7280092592592592 | 50.046 |
| 0.7280208333333333 | 50.045 |
| 0.7280324074074075 | 50.044 |
| 0.7280439814814814 | 50.044 |
| 0.7280555555555556 | 50.043 |
| 0.7280671296296296 | 50.043 |
| 0.7280787037037038 | 50.04 |
| 0.7280902777777777 | 50.041 |
| 0.7281018518518518 | 50.042 |
| 0.728113425925926 | 50.042 |
| 0.728125 | 50.042 |
| 0.7281365740740741 | 50.041 |
| 0.7281481481481481 | 50.041 |
| 0.7281597222222222 | 50.042 |
| 0.7281712962962964 | 50.042 |
| 0.7281828703703703 | 50.043 |
| 0.7281944444444445 | 50.045 |
| 0.7282060185185185 | 50.046 |
| 0.7282175925925927 | 50.044 |
| 0.7282291666666666 | 50.046 |
| 0.7282407407407407 | 50.046 |
| 0.7282523148148149 | 50.048 |
| 0.7282638888888888 | 50.05 |
| 0.728275462962963 | 50.049 |
| 0.728287037037037 | 50.051 |
| 0.7282986111111112 | 50.052 |
| 0.7283101851851851 | 50.051 |
| 0.7283217592592592 | 50.052 |
| 0.7283333333333334 | 50.053 |
| 0.7283449074074074 | 50.054 |
| 0.7283564814814815 | 50.055 |
| 0.7283680555555555 | 50.055 |
| 0.7283796296296297 | 50.056 |
| 0.7283912037037038 | 50.056 |
| 0.7284027777777777 | 50.056 |
| 0.7284143518518519 | 50.056 |
| 0.7284259259259259 | 50.055 |
| 0.7284375000000001 | 50.055 |
| 0.728449074074074 | 50.054 |
| 0.7284606481481481 | 50.053 |
| 0.7284722222222223 | 50.053 |
| 0.7284837962962962 | 50.051 |
| 0.7284953703703704 | 50.05 |
| 0.7285069444444444 | 50.05 |
| 0.7285185185185186 | 50.049 |
| 0.7285300925925925 | 50.049 |
| 0.7285416666666666 | 50.047 |
| 0.7285532407407408 | 50.046 |
| 0.7285648148148148 | 50.044 |
| 0.7285763888888889 | 50.042 |
| 0.7285879629629629 | 50.04 |
| 0.7285995370370371 | 50.037 |
| 0.7286111111111112 | 50.034 |
| 0.7286226851851851 | 50.032 |
| 0.7286342592592593 | 50.029 |
| 0.7286458333333333 | 50.026 |
| 0.7286574074074075 | 50.025 |
| 0.7286689814814814 | 50.023 |
| 0.7286805555555556 | 50.02 |
| 0.7286921296296297 | 50.019 |
| 0.7287037037037036 | 50.019 |
| 0.7287152777777778 | 50.019 |
| 0.7287268518518518 | 50.019 |
| 0.728738425925926 | 50.018 |
| 0.7287499999999999 | 50.015 |
| 0.728761574074074 | 50.015 |
| 0.7287731481481482 | 50.015 |
| 0.7287847222222222 | 50.015 |
| 0.7287962962962963 | 50.014 |
| 0.7288078703703703 | 50.012 |
| 0.7288194444444445 | 50.013 |
| 0.7288310185185186 | 50.013 |
| 0.7288425925925925 | 50.014 |
| 0.7288541666666667 | 50.016 |
| 0.7288657407407407 | 50.018 |
| 0.7288773148148149 | 50.023 |
| 0.7288888888888888 | 50.024 |
| 0.728900462962963 | 50.026 |
| 0.7289120370370371 | 50.027 |
| 0.728923611111111 | 50.029 |
| 0.7289351851851852 | 50.029 |
| 0.7289467592592592 | 50.03 |
| 0.7289583333333334 | 50.03 |
| 0.7289699074074073 | 50.03 |
| 0.7289814814814815 | 50.03 |
| 0.7289930555555556 | 50.03 |
| 0.7290046296296296 | 50.03 |
| 0.7290162037037037 | 50.03 |
| 0.7290277777777777 | 50.03 |
| 0.7290393518518519 | 50.028 |
| 0.729050925925926 | 50.028 |
| 0.7290625 | 50.027 |
| 0.7290740740740741 | 50.025 |
| 0.7290856481481481 | 50.025 |
| 0.7290972222222223 | 50.025 |
| 0.7291087962962962 | 50.024 |
| 0.7291203703703704 | 50.025 |
| 0.7291319444444445 | 50.026 |
| 0.7291435185185186 | 50.028 |
| 0.7291550925925926 | 50.029 |
| 0.7291666666666666 | 50.029 |
| 0.7291782407407408 | 50.026 |
| 0.7291898148148147 | 50.026 |
| 0.7292013888888889 | 50.025 |
| 0.729212962962963 | 50.023 |
| 0.729224537037037 | 50.026 |
| 0.7292361111111111 | 50.029 |
| 0.7292476851851851 | 50.031 |
| 0.7292592592592593 | 50.034 |
| 0.7292708333333334 | 50.037 |
| 0.7292824074074074 | 50.041 |
| 0.7292939814814815 | 50.045 |
| 0.7293055555555555 | 50.047 |
| 0.7293171296296297 | 50.05 |
| 0.7293287037037036 | 50.054 |
| 0.7293402777777778 | 50.054 |
| 0.7293518518518519 | 50.055 |
| 0.729363425925926 | 50.058 |
| 0.729375 | 50.059 |
| 0.729386574074074 | 50.06 |
| 0.7293981481481482 | 50.058 |
| 0.7294097222222223 | 50.058 |
| 0.7294212962962963 | 50.057 |
| 0.7294328703703704 | 50.054 |
| 0.7294444444444445 | 50.053 |
| 0.7294560185185185 | 50.053 |
| 0.7294675925925925 | 50.053 |
| 0.7294791666666667 | 50.051 |
| 0.7294907407407408 | 50.052 |
| 0.7295023148148148 | 50.053 |
| 0.7295138888888889 | 50.055 |
| 0.729525462962963 | 50.055 |
| 0.7295370370370371 | 50.057 |
| 0.729548611111111 | 50.058 |
| 0.7295601851851852 | 50.058 |
| 0.7295717592592593 | 50.059 |
| 0.7295833333333334 | 50.059 |
| 0.7295949074074074 | 50.058 |
| 0.7296064814814814 | 50.057 |
| 0.7296180555555556 | 50.054 |
| 0.7296296296296297 | 50.054 |
| 0.7296412037037037 | 50.053 |
| 0.7296527777777778 | 50.054 |
| 0.7296643518518519 | 50.056 |
| 0.7296759259259259 | 50.058 |
| 0.7296874999999999 | 50.059 |
| 0.7296990740740741 | 50.056 |
| 0.7297106481481482 | 50.057 |
| 0.7297222222222222 | 50.06 |
| 0.7297337962962963 | 50.062 |
| 0.7297453703703703 | 50.061 |
| 0.7297569444444445 | 50.062 |
| 0.7297685185185184 | 50.06 |
| 0.7297800925925926 | 50.059 |
| 0.7297916666666667 | 50.058 |
| 0.7298032407407408 | 50.057 |
| 0.7298148148148148 | 50.058 |
| 0.7298263888888888 | 50.058 |
| 0.729837962962963 | 50.06 |
| 0.7298495370370371 | 50.059 |
| 0.7298611111111111 | 50.059 |
| 0.7298726851851852 | 50.058 |
| 0.7298842592592593 | 50.056 |
| 0.7298958333333333 | 50.054 |
| 0.7299074074074073 | 50.052 |
| 0.7299189814814815 | 50.049 |
| 0.7299305555555556 | 50.047 |
| 0.7299421296296296 | 50.047 |
| 0.7299537037037037 | 50.047 |
| 0.7299652777777778 | 50.046 |
| 0.7299768518518519 | 50.046 |
| 0.7299884259259258 | 50.046 |
| 0.73 | 50.044 |
| 0.7300115740740741 | 50.045 |
| 0.7300231481481482 | 50.044 |
| 0.7300347222222222 | 50.043 |
| 0.7300462962962962 | 50.044 |
| 0.7300578703703704 | 50.043 |
| 0.7300694444444445 | 50.043 |
| 0.7300810185185185 | 50.042 |
| 0.7300925925925926 | 50.045 |
| 0.7301041666666667 | 50.046 |
| 0.7301157407407407 | 50.049 |
| 0.7301273148148147 | 50.052 |
| 0.7301388888888889 | 50.054 |
| 0.730150462962963 | 50.056 |
| 0.730162037037037 | 50.058 |
| 0.7301736111111111 | 50.061 |
| 0.7301851851851852 | 50.064 |
| 0.7301967592592593 | 50.068 |
| 0.7302083333333332 | 50.069 |
| 0.7302199074074074 | 50.07 |
| 0.7302314814814815 | 50.07 |
| 0.7302430555555556 | 50.071 |
| 0.7302546296296296 | 50.069 |
| 0.7302662037037037 | 50.071 |
| 0.7302777777777778 | 50.072 |
| 0.730289351851852 | 50.074 |
| 0.7303009259259259 | 50.073 |
| 0.7303125 | 50.075 |
| 0.7303240740740741 | 50.078 |
| 0.7303356481481482 | 50.078 |
| 0.7303472222222221 | 50.079 |
| 0.7303587962962963 | 50.078 |
| 0.7303703703703704 | 50.077 |
| 0.7303819444444444 | 50.077 |
| 0.7303935185185185 | 50.076 |
| 0.7304050925925926 | 50.076 |
| 0.7304166666666667 | 50.075 |
| 0.7304282407407406 | 50.074 |
| 0.7304398148148148 | 50.073 |
| 0.7304513888888889 | 50.074 |
| 0.730462962962963 | 50.073 |
| 0.730474537037037 | 50.071 |
| 0.7304861111111111 | 50.071 |
| 0.7304976851851852 | 50.069 |
| 0.7305092592592594 | 50.068 |
| 0.7305208333333333 | 50.066 |
| 0.7305324074074074 | 50.067 |
| 0.7305439814814815 | 50.069 |
| 0.7305555555555556 | 50.069 |
| 0.7305671296296296 | 50.07 |
| 0.7305787037037037 | 50.07 |
| 0.7305902777777779 | 50.068 |
| 0.7306018518518519 | 50.068 |
| 0.7306134259259259 | 50.066 |
| 0.730625 | 50.068 |
| 0.7306365740740741 | 50.066 |
| 0.730648148148148 | 50.063 |
| 0.7306597222222222 | 50.062 |
| 0.7306712962962963 | 50.061 |
| 0.7306828703703704 | 50.063 |
| 0.7306944444444444 | 50.061 |
| 0.7307060185185185 | 50.061 |
| 0.7307175925925926 | 50.06 |
| 0.7307291666666668 | 50.057 |
| 0.7307407407407407 | 50.056 |
| 0.7307523148148148 | 50.054 |
| 0.7307638888888889 | 50.052 |
| 0.730775462962963 | 50.05 |
| 0.730787037037037 | 50.047 |
| 0.7307986111111111 | 50.045 |
| 0.7308101851851853 | 50.044 |
| 0.7308217592592593 | 50.044 |
| 0.7308333333333333 | 50.044 |
| 0.7308449074074074 | 50.043 |
| 0.7308564814814815 | 50.043 |
| 0.7308680555555555 | 50.042 |
| 0.7308796296296296 | 50.042 |
| 0.7308912037037038 | 50.042 |
| 0.7309027777777778 | 50.042 |
| 0.7309143518518518 | 50.045 |
| 0.7309259259259259 | 50.046 |
| 0.7309375 | 50.049 |
| 0.7309490740740742 | 50.05 |
| 0.7309606481481481 | 50.052 |
| 0.7309722222222222 | 50.054 |
| 0.7309837962962963 | 50.059 |
| 0.7309953703703704 | 50.063 |
| 0.7310069444444444 | 50.065 |
| 0.7310185185185185 | 50.069 |
| 0.7310300925925927 | 50.071 |
| 0.7310416666666667 | 50.071 |
| 0.7310532407407407 | 50.072 |
| 0.7310648148148148 | 50.072 |
| 0.7310763888888889 | 50.073 |
| 0.7310879629629629 | 50.074 |
| 0.731099537037037 | 50.074 |
| 0.7311111111111112 | 50.071 |
| 0.7311226851851852 | 50.072 |
| 0.7311342592592592 | 50.07 |
| 0.7311458333333333 | 50.067 |
| 0.7311574074074074 | 50.065 |
| 0.7311689814814816 | 50.063 |
| 0.7311805555555555 | 50.061 |
| 0.7311921296296297 | 50.059 |
| 0.7312037037037037 | 50.057 |
| 0.7312152777777778 | 50.057 |
| 0.7312268518518518 | 50.054 |
| 0.7312384259259259 | 50.054 |
| 0.7312500000000001 | 50.053 |
| 0.7312615740740741 | 50.055 |
| 0.7312731481481481 | 50.053 |
| 0.7312847222222222 | 50.054 |
| 0.7312962962962963 | 50.055 |
| 0.7313078703703703 | 50.056 |
| 0.7313194444444444 | 50.055 |
| 0.7313310185185186 | 50.06 |
| 0.7313425925925926 | 50.063 |
| 0.7313541666666666 | 50.066 |
| 0.7313657407407407 | 50.07 |
| 0.7313773148148148 | 50.071 |
| 0.731388888888889 | 50.073 |
| 0.7314004629629629 | 50.076 |
| 0.731412037037037 | 50.076 |
| 0.7314236111111111 | 50.077 |
| 0.7314351851851852 | 50.076 |
| 0.7314467592592592 | 50.075 |
| 0.7314583333333333 | 50.074 |
| 0.7314699074074075 | 50.073 |
| 0.7314814814814815 | 50.074 |
| 0.7314930555555555 | 50.072 |
| 0.7315046296296296 | 50.071 |
| 0.7315162037037037 | 50.071 |
| 0.7315277777777777 | 50.071 |
| 0.7315393518518518 | 50.069 |
| 0.731550925925926 | 50.068 |
| 0.7315625 | 50.07 |
| 0.731574074074074 | 50.071 |
| 0.7315856481481481 | 50.069 |
| 0.7315972222222222 | 50.07 |
| 0.7316087962962964 | 50.07 |
| 0.7316203703703703 | 50.07 |
| 0.7316319444444445 | 50.07 |
| 0.7316435185185185 | 50.071 |
| 0.7316550925925926 | 50.072 |
| 0.7316666666666666 | 50.069 |
| 0.7316782407407407 | 50.067 |
| 0.7316898148148149 | 50.066 |
| 0.7317013888888889 | 50.064 |
| 0.731712962962963 | 50.062 |
| 0.731724537037037 | 50.061 |
| 0.7317361111111111 | 50.059 |
| 0.7317476851851853 | 50.06 |
| 0.7317592592592592 | 50.058 |
| 0.7317708333333334 | 50.056 |
| 0.7317824074074074 | 50.057 |
| 0.7317939814814814 | 50.056 |
| 0.7318055555555555 | 50.055 |
| 0.7318171296296296 | 50.054 |
| 0.7318287037037038 | 50.053 |
| 0.7318402777777777 | 50.051 |
| 0.7318518518518519 | 50.049 |
| 0.7318634259259259 | 50.048 |
| 0.731875 | 50.048 |
| 0.731886574074074 | 50.048 |
| 0.7318981481481481 | 50.046 |
| 0.7319097222222223 | 50.046 |
| 0.7319212962962963 | 50.048 |
| 0.7319328703703704 | 50.049 |
| 0.7319444444444444 | 50.049 |
| 0.7319560185185185 | 50.047 |
| 0.7319675925925927 | 50.048 |
| 0.7319791666666666 | 50.047 |
| 0.7319907407407408 | 50.047 |
| 0.7320023148148148 | 50.049 |
| 0.732013888888889 | 50.051 |
| 0.7320254629629629 | 50.052 |
| 0.732037037037037 | 50.056 |
| 0.7320486111111112 | 50.057 |
| 0.7320601851851851 | 50.06 |
| 0.7320717592592593 | 50.062 |
| 0.7320833333333333 | 50.063 |
| 0.7320949074074075 | 50.065 |
| 0.7321064814814814 | 50.065 |
| 0.7321180555555555 | 50.066 |
| 0.7321296296296297 | 50.064 |
| 0.7321412037037037 | 50.064 |
| 0.7321527777777778 | 50.064 |
| 0.7321643518518518 | 50.063 |
| 0.732175925925926 | 50.065 |
| 0.7321875000000001 | 50.068 |
| 0.732199074074074 | 50.068 |
| 0.7322106481481482 | 50.068 |
| 0.7322222222222222 | 50.068 |
| 0.7322337962962964 | 50.069 |
| 0.7322453703703703 | 50.068 |
| 0.7322569444444444 | 50.068 |
| 0.7322685185185186 | 50.068 |
| 0.7322800925925925 | 50.069 |
| 0.7322916666666667 | 50.07 |
| 0.7323032407407407 | 50.07 |
| 0.7323148148148149 | 50.07 |
| 0.7323263888888888 | 50.069 |
| 0.7323379629629629 | 50.069 |
| 0.7323495370370371 | 50.066 |
| 0.7323611111111111 | 50.064 |
| 0.7323726851851852 | 50.064 |
| 0.7323842592592592 | 50.065 |
| 0.7323958333333334 | 50.064 |
| 0.7324074074074075 | 50.063 |
| 0.7324189814814814 | 50.061 |
| 0.7324305555555556 | 50.059 |
| 0.7324421296296296 | 50.058 |
| 0.7324537037037038 | 50.057 |
| 0.7324652777777777 | 50.056 |
| 0.7324768518518519 | 50.056 |
| 0.732488425925926 | 50.053 |
| 0.7324999999999999 | 50.054 |
| 0.7325115740740741 | 50.054 |
| 0.7325231481481481 | 50.054 |
| 0.7325347222222223 | 50.053 |
| 0.7325462962962962 | 50.054 |
| 0.7325578703703703 | 50.053 |
| 0.7325694444444445 | 50.05 |
| 0.7325810185185185 | 50.047 |
| 0.7325925925925926 | 50.047 |
| 0.7326041666666666 | 50.047 |
| 0.7326157407407408 | 50.047 |
| 0.7326273148148149 | 50.046 |
| 0.7326388888888888 | 50.045 |
| 0.732650462962963 | 50.045 |
| 0.732662037037037 | 50.045 |
| 0.7326736111111112 | 50.047 |
| 0.7326851851851851 | 50.052 |
| 0.7326967592592593 | 50.054 |
| 0.7327083333333334 | 50.053 |
| 0.7327199074074073 | 50.054 |
| 0.7327314814814815 | 50.056 |
| 0.7327430555555555 | 50.055 |
| 0.7327546296296297 | 50.055 |
| 0.7327662037037036 | 50.054 |
| 0.7327777777777778 | 50.053 |
| 0.7327893518518519 | 50.053 |
| 0.7328009259259259 | 50.052 |
| 0.7328125 | 50.051 |
| 0.732824074074074 | 50.048 |
| 0.7328356481481482 | 50.049 |
| 0.7328472222222223 | 50.047 |
| 0.7328587962962962 | 50.047 |
| 0.7328703703703704 | 50.047 |
| 0.7328819444444444 | 50.047 |
| 0.7328935185185186 | 50.045 |
| 0.7329050925925925 | 50.045 |
| 0.7329166666666667 | 50.044 |
| 0.7329282407407408 | 50.043 |
| 0.7329398148148147 | 50.041 |
| 0.7329513888888889 | 50.044 |
| 0.7329629629629629 | 50.045 |
| 0.7329745370370371 | 50.045 |
| 0.732986111111111 | 50.046 |
| 0.7329976851851852 | 50.047 |
| 0.7330092592592593 | 50.048 |
| 0.7330208333333333 | 50.049 |
| 0.7330324074074074 | 50.051 |
| 0.7330439814814814 | 50.054 |
| 0.7330555555555556 | 50.057 |
| 0.7330671296296297 | 50.06 |
| 0.7330787037037036 | 50.061 |
| 0.7330902777777778 | 50.063 |
| 0.7331018518518518 | 50.066 |
| 0.733113425925926 | 50.069 |
| 0.7331249999999999 | 50.071 |
| 0.7331365740740741 | 50.073 |
| 0.7331481481481482 | 50.075 |
| 0.7331597222222223 | 50.076 |
| 0.7331712962962963 | 50.079 |
| 0.7331828703703703 | 50.082 |
| 0.7331944444444445 | 50.084 |
| 0.7332060185185186 | 50.084 |
| 0.7332175925925926 | 50.083 |
| 0.7332291666666667 | 50.081 |
| 0.7332407407407407 | 50.08 |
| 0.7332523148148148 | 50.077 |
| 0.7332638888888888 | 50.076 |
| 0.733275462962963 | 50.075 |
| 0.7332870370370371 | 50.074 |
| 0.733298611111111 | 50.072 |
| 0.7333101851851852 | 50.073 |
| 0.7333217592592592 | 50.075 |
| 0.7333333333333334 | 50.075 |
| 0.7333449074074073 | 50.075 |
| 0.7333564814814815 | 50.074 |
| 0.7333680555555556 | 50.074 |
| 0.7333796296296297 | 50.074 |
| 0.7333912037037037 | 50.077 |
| 0.7334027777777777 | 50.079 |
| 0.7334143518518519 | 50.081 |
| 0.733425925925926 | 50.084 |
| 0.7334375 | 50.084 |
| 0.7334490740740741 | 50.086 |
| 0.7334606481481482 | 50.087 |
| 0.7334722222222222 | 50.089 |
| 0.7334837962962962 | 50.092 |
| 0.7334953703703704 | 50.097 |
| 0.7335069444444445 | 50.101 |
| 0.7335185185185185 | 50.104 |
| 0.7335300925925926 | 50.109 |
| 0.7335416666666666 | 50.113 |
| 0.7335532407407408 | 50.114 |
| 0.7335648148148147 | 50.113 |
| 0.7335763888888889 | 50.112 |
| 0.733587962962963 | 50.112 |
| 0.7335995370370371 | 50.111 |
| 0.7336111111111111 | 50.109 |
| 0.7336226851851851 | 50.109 |
| 0.7336342592592593 | 50.109 |
| 0.7336458333333334 | 50.107 |
| 0.7336574074074074 | 50.104 |
| 0.7336689814814815 | 50.102 |
| 0.7336805555555556 | 50.098 |
| 0.7336921296296296 | 50.096 |
| 0.7337037037037036 | 50.092 |
| 0.7337152777777778 | 50.088 |
| 0.7337268518518519 | 50.084 |
| 0.7337384259259259 | 50.082 |
| 0.73375 | 50.081 |
| 0.733761574074074 | 50.083 |
| 0.7337731481481482 | 50.087 |
| 0.7337847222222221 | 50.091 |
| 0.7337962962962963 | 50.095 |
| 0.7338078703703704 | 50.099 |
| 0.7338194444444445 | 50.101 |
| 0.7338310185185185 | 50.103 |
| 0.7338425925925925 | 50.107 |
| 0.7338541666666667 | 50.109 |
| 0.7338657407407408 | 50.111 |
| 0.7338773148148148 | 50.111 |
| 0.7338888888888889 | 50.11 |
| 0.733900462962963 | 50.11 |
| 0.733912037037037 | 50.112 |
| 0.733923611111111 | 50.112 |
| 0.7339351851851852 | 50.112 |
| 0.7339467592592593 | 50.112 |
| 0.7339583333333333 | 50.11 |
| 0.7339699074074074 | 50.109 |
| 0.7339814814814815 | 50.108 |
| 0.7339930555555556 | 50.108 |
| 0.7340046296296295 | 50.107 |
| 0.7340162037037037 | 50.107 |
| 0.7340277777777778 | 50.108 |
| 0.7340393518518519 | 50.109 |
| 0.7340509259259259 | 50.109 |
| 0.7340625 | 50.112 |
| 0.7340740740740741 | 50.115 |
| 0.7340856481481483 | 50.118 |
| 0.7340972222222222 | 50.12 |
| 0.7341087962962963 | 50.122 |
| 0.7341203703703704 | 50.123 |
| 0.7341319444444444 | 50.126 |
| 0.7341435185185184 | 50.128 |
| 0.7341550925925926 | 50.131 |
| 0.7341666666666667 | 50.132 |
| 0.7341782407407407 | 50.131 |
| 0.7341898148148148 | 50.131 |
| 0.7342013888888889 | 50.131 |
| 0.734212962962963 | 50.129 |
| 0.7342245370370369 | 50.127 |
| 0.7342361111111111 | 50.126 |
| 0.7342476851851852 | 50.124 |
| 0.7342592592592593 | 50.121 |
| 0.7342708333333333 | 50.119 |
| 0.7342824074074074 | 50.117 |
| 0.7342939814814815 | 50.116 |
| 0.7343055555555557 | 50.116 |
| 0.7343171296296296 | 50.116 |
| 0.7343287037037037 | 50.117 |
| 0.7343402777777778 | 50.118 |
| 0.7343518518518519 | 50.119 |
| 0.7343634259259259 | 50.121 |
| 0.734375 | 50.121 |
| 0.7343865740740741 | 50.122 |
| 0.7343981481481481 | 50.121 |
| 0.7344097222222222 | 50.119 |
| 0.7344212962962963 | 50.118 |
| 0.7344328703703704 | 50.118 |
| 0.7344444444444443 | 50.117 |
| 0.7344560185185185 | 50.115 |
| 0.7344675925925926 | 50.114 |
| 0.7344791666666667 | 50.114 |
| 0.7344907407407407 | 50.114 |
| 0.7345023148148148 | 50.114 |
| 0.7345138888888889 | 50.115 |
| 0.7345254629629631 | 50.115 |
| 0.734537037037037 | 50.116 |
| 0.7345486111111111 | 50.115 |
| 0.7345601851851852 | 50.115 |
| 0.7345717592592593 | 50.114 |
| 0.7345833333333333 | 50.116 |
| 0.7345949074074074 | 50.114 |
| 0.7346064814814816 | 50.115 |
| 0.7346180555555556 | 50.115 |
| 0.7346296296296296 | 50.116 |
| 0.7346412037037037 | 50.117 |
| 0.7346527777777778 | 50.119 |
| 0.7346643518518517 | 50.121 |
| 0.7346759259259259 | 50.122 |
| 0.7346875 | 50.123 |
| 0.7346990740740741 | 50.123 |
| 0.7347106481481481 | 50.125 |
| 0.7347222222222222 | 50.126 |
| 0.7347337962962963 | 50.124 |
| 0.7347453703703705 | 50.125 |
| 0.7347569444444444 | 50.127 |
| 0.7347685185185185 | 50.125 |
| 0.7347800925925926 | 50.127 |
| 0.7347916666666667 | 50.127 |
| 0.7348032407407407 | 50.13 |
| 0.7348148148148148 | 50.132 |
| 0.734826388888889 | 50.133 |
| 0.734837962962963 | 50.134 |
| 0.734849537037037 | 50.134 |
| 0.7348611111111111 | 50.134 |
| 0.7348726851851852 | 50.131 |
| 0.7348842592592592 | 50.131 |
| 0.7348958333333333 | 50.128 |
| 0.7349074074074075 | 50.126 |
| 0.7349189814814815 | 50.123 |
| 0.7349305555555555 | 50.121 |
| 0.7349421296296296 | 50.118 |
| 0.7349537037037037 | 50.115 |
| 0.7349652777777779 | 50.109 |
| 0.7349768518518518 | 50.105 |
| 0.734988425925926 | 50.099 |
| 0.735 | 50.094 |
| 0.7350115740740741 | 50.09 |
| 0.7350231481481481 | 50.087 |
| 0.7350347222222222 | 50.083 |
| 0.7350462962962964 | 50.082 |
| 0.7350578703703704 | 50.081 |
| 0.7350694444444444 | 50.079 |
| 0.7350810185185185 | 50.079 |
| 0.7350925925925926 | 50.078 |
| 0.7351041666666666 | 50.077 |
| 0.7351157407407407 | 50.075 |
| 0.7351273148148149 | 50.074 |
| 0.7351388888888889 | 50.073 |
| 0.7351504629629629 | 50.071 |
| 0.735162037037037 | 50.069 |
| 0.7351736111111111 | 50.065 |
| 0.7351851851851853 | 50.064 |
| 0.7351967592592592 | 50.06 |
| 0.7352083333333334 | 50.06 |
| 0.7352199074074074 | 50.058 |
| 0.7352314814814815 | 50.058 |
| 0.7352430555555555 | 50.057 |
| 0.7352546296296296 | 50.058 |
| 0.7352662037037038 | 50.058 |
| 0.7352777777777778 | 50.056 |
| 0.7352893518518518 | 50.056 |
| 0.7353009259259259 | 50.056 |
| 0.7353125 | 50.055 |
| 0.735324074074074 | 50.056 |
| 0.7353356481481481 | 50.059 |
| 0.7353472222222223 | 50.062 |
| 0.7353587962962963 | 50.062 |
| 0.7353703703703703 | 50.069 |
| 0.7353819444444444 | 50.072 |
| 0.7353935185185185 | 50.074 |
| 0.7354050925925927 | 50.077 |
| 0.7354166666666666 | 50.078 |
| 0.7354282407407408 | 50.079 |
| 0.7354398148148148 | 50.078 |
| 0.735451388888889 | 50.077 |
| 0.7354629629629629 | 50.077 |
| 0.735474537037037 | 50.077 |
| 0.7354861111111112 | 50.077 |
| 0.7354976851851852 | 50.079 |
| 0.7355092592592593 | 50.081 |
| 0.7355208333333333 | 50.081 |
| 0.7355324074074074 | 50.081 |
| 0.7355439814814814 | 50.078 |
| 0.7355555555555555 | 50.079 |
| 0.7355671296296297 | 50.078 |
| 0.7355787037037037 | 50.075 |
| 0.7355902777777777 | 50.072 |
| 0.7356018518518518 | 50.071 |
| 0.7356134259259259 | 50.07 |
| 0.7356250000000001 | 50.07 |
| 0.735636574074074 | 50.068 |
| 0.7356481481481482 | 50.065 |
| 0.7356597222222222 | 50.062 |
| 0.7356712962962964 | 50.06 |
| 0.7356828703703703 | 50.057 |
| 0.7356944444444444 | 50.056 |
| 0.7357060185185186 | 50.055 |
| 0.7357175925925926 | 50.055 |
| 0.7357291666666667 | 50.053 |
| 0.7357407407407407 | 50.052 |
| 0.7357523148148148 | 50.048 |
| 0.735763888888889 | 50.046 |
| 0.7357754629629629 | 50.046 |
| 0.7357870370370371 | 50.046 |
| 0.7357986111111111 | 50.047 |
| 0.7358101851851853 | 50.05 |
| 0.7358217592592592 | 50.053 |
| 0.7358333333333333 | 50.054 |
| 0.7358449074074075 | 50.056 |
| 0.7358564814814814 | 50.059 |
| 0.7358680555555556 | 50.062 |
| 0.7358796296296296 | 50.065 |
| 0.7358912037037038 | 50.067 |
| 0.7359027777777777 | 50.07 |
| 0.7359143518518518 | 50.07 |
| 0.735925925925926 | 50.071 |
| 0.7359375 | 50.071 |
| 0.7359490740740741 | 50.071 |
| 0.7359606481481481 | 50.072 |
| 0.7359722222222222 | 50.071 |
| 0.7359837962962964 | 50.071 |
| 0.7359953703703703 | 50.071 |
| 0.7360069444444445 | 50.074 |
| 0.7360185185185185 | 50.076 |
| 0.7360300925925927 | 50.077 |
| 0.7360416666666666 | 50.078 |
| 0.7360532407407407 | 50.079 |
| 0.7360648148148149 | 50.08 |
| 0.7360763888888888 | 50.08 |
| 0.736087962962963 | 50.08 |
| 0.736099537037037 | 50.08 |
| 0.7361111111111112 | 50.08 |
| 0.7361226851851851 | 50.079 |
| 0.7361342592592592 | 50.08 |
| 0.7361458333333334 | 50.082 |
| 0.7361574074074074 | 50.081 |
| 0.7361689814814815 | 50.082 |
| 0.7361805555555555 | 50.084 |
| 0.7361921296296297 | 50.084 |
| 0.7362037037037038 | 50.085 |
| 0.7362152777777777 | 50.087 |
| 0.7362268518518519 | 50.086 |
| 0.7362384259259259 | 50.086 |
| 0.7362500000000001 | 50.084 |
| 0.736261574074074 | 50.081 |
| 0.7362731481481481 | 50.08 |
| 0.7362847222222223 | 50.081 |
| 0.7362962962962962 | 50.081 |
| 0.7363078703703704 | 50.083 |
| 0.7363194444444444 | 50.085 |
| 0.7363310185185186 | 50.086 |
| 0.7363425925925925 | 50.086 |
| 0.7363541666666666 | 50.087 |
| 0.7363657407407408 | 50.089 |
| 0.7363773148148148 | 50.091 |
| 0.7363888888888889 | 50.091 |
| 0.7364004629629629 | 50.091 |
| 0.7364120370370371 | 50.091 |
| 0.7364236111111112 | 50.091 |
| 0.7364351851851851 | 50.091 |
| 0.7364467592592593 | 50.091 |
| 0.7364583333333333 | 50.089 |
| 0.7364699074074075 | 50.087 |
| 0.7364814814814814 | 50.084 |
| 0.7364930555555556 | 50.083 |
| 0.7365046296296297 | 50.082 |
| 0.7365162037037036 | 50.081 |
| 0.7365277777777778 | 50.081 |
| 0.7365393518518518 | 50.081 |
| 0.736550925925926 | 50.083 |
| 0.7365624999999999 | 50.081 |
| 0.736574074074074 | 50.08 |
| 0.7365856481481482 | 50.082 |
| 0.7365972222222222 | 50.081 |
| 0.7366087962962963 | 50.08 |
| 0.7366203703703703 | 50.078 |
| 0.7366319444444445 | 50.078 |
| 0.7366435185185186 | 50.078 |
| 0.7366550925925925 | 50.079 |
| 0.7366666666666667 | 50.08 |
| 0.7366782407407407 | 50.082 |
| 0.7366898148148149 | 50.084 |
| 0.7367013888888888 | 50.082 |
| 0.736712962962963 | 50.082 |
| 0.7367245370370371 | 50.082 |
| 0.736736111111111 | 50.085 |
| 0.7367476851851852 | 50.087 |
| 0.7367592592592592 | 50.088 |
| 0.7367708333333334 | 50.089 |
| 0.7367824074074073 | 50.09 |
| 0.7367939814814815 | 50.09 |